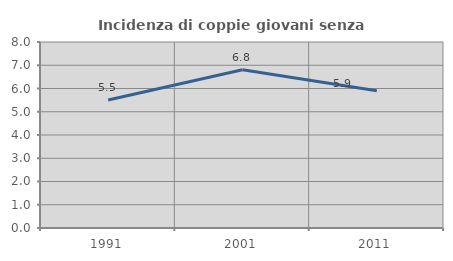
| Category | Incidenza di coppie giovani senza figli |
|---|---|
| 1991.0 | 5.502 |
| 2001.0 | 6.81 |
| 2011.0 | 5.905 |